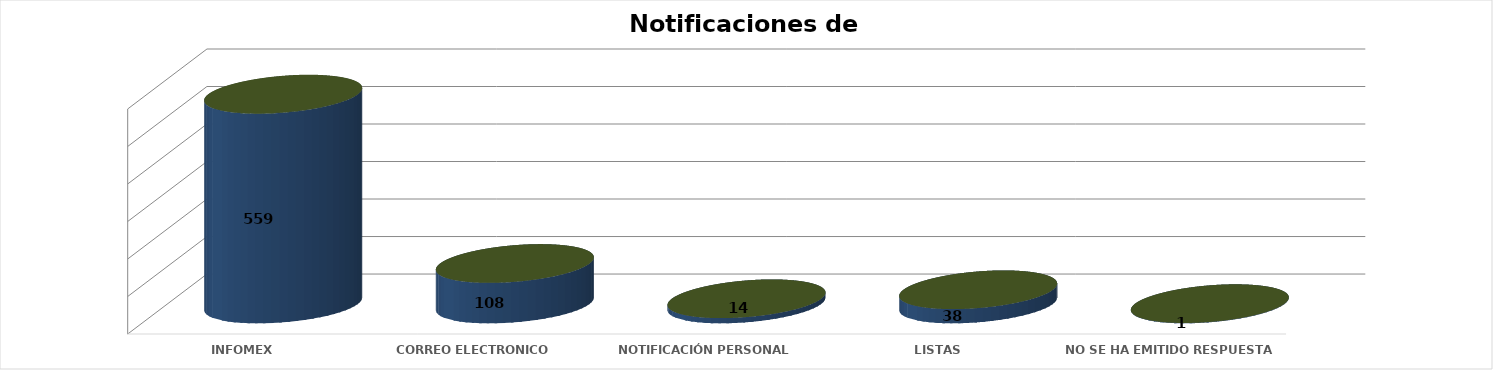
| Category | Series 0 | Series 1 | Series 2 | Series 3 | Series 4 |
|---|---|---|---|---|---|
| INFOMEX |  |  |  | 559 | 0.776 |
| CORREO ELECTRONICO |  |  |  | 108 | 0.15 |
| NOTIFICACIÓN PERSONAL |  |  |  | 14 | 0.019 |
| LISTAS |  |  |  | 38 | 0.053 |
|  NO SE HA EMITIDO RESPUESTA |  |  |  | 1 | 0.001 |